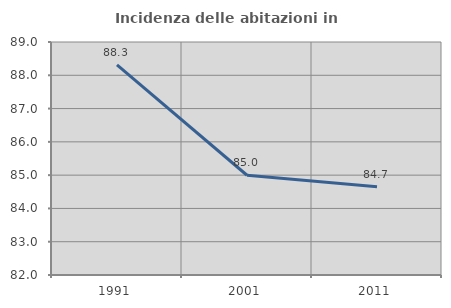
| Category | Incidenza delle abitazioni in proprietà  |
|---|---|
| 1991.0 | 88.315 |
| 2001.0 | 84.996 |
| 2011.0 | 84.654 |